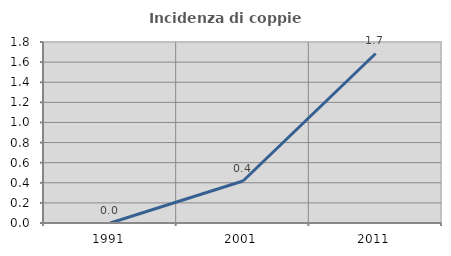
| Category | Incidenza di coppie miste |
|---|---|
| 1991.0 | 0 |
| 2001.0 | 0.418 |
| 2011.0 | 1.686 |